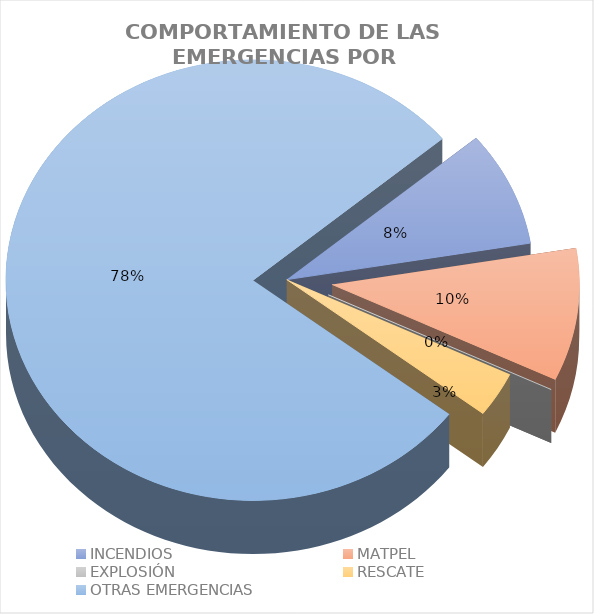
| Category | Incidentes |
|---|---|
| INCENDIOS | 0.085 |
| MATPEL | 0.097 |
| EXPLOSIÓN | 0 |
| RESCATE | 0.033 |
| OTRAS EMERGENCIAS | 0.785 |